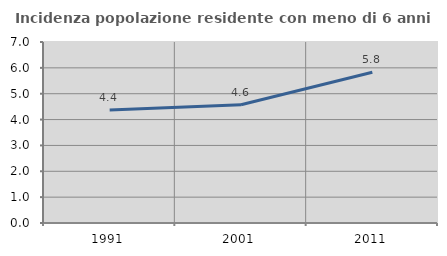
| Category | Incidenza popolazione residente con meno di 6 anni |
|---|---|
| 1991.0 | 4.374 |
| 2001.0 | 4.571 |
| 2011.0 | 5.833 |